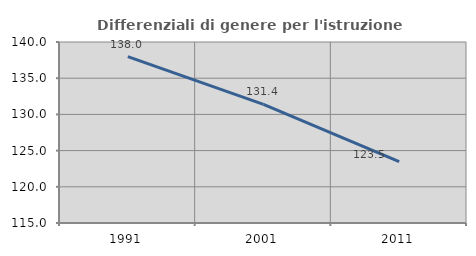
| Category | Differenziali di genere per l'istruzione superiore |
|---|---|
| 1991.0 | 137.978 |
| 2001.0 | 131.384 |
| 2011.0 | 123.486 |